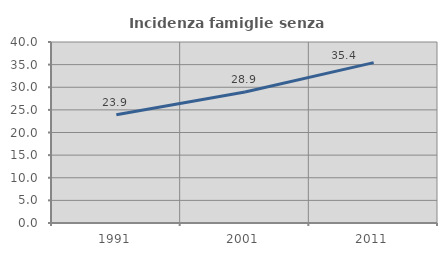
| Category | Incidenza famiglie senza nuclei |
|---|---|
| 1991.0 | 23.945 |
| 2001.0 | 28.933 |
| 2011.0 | 35.437 |